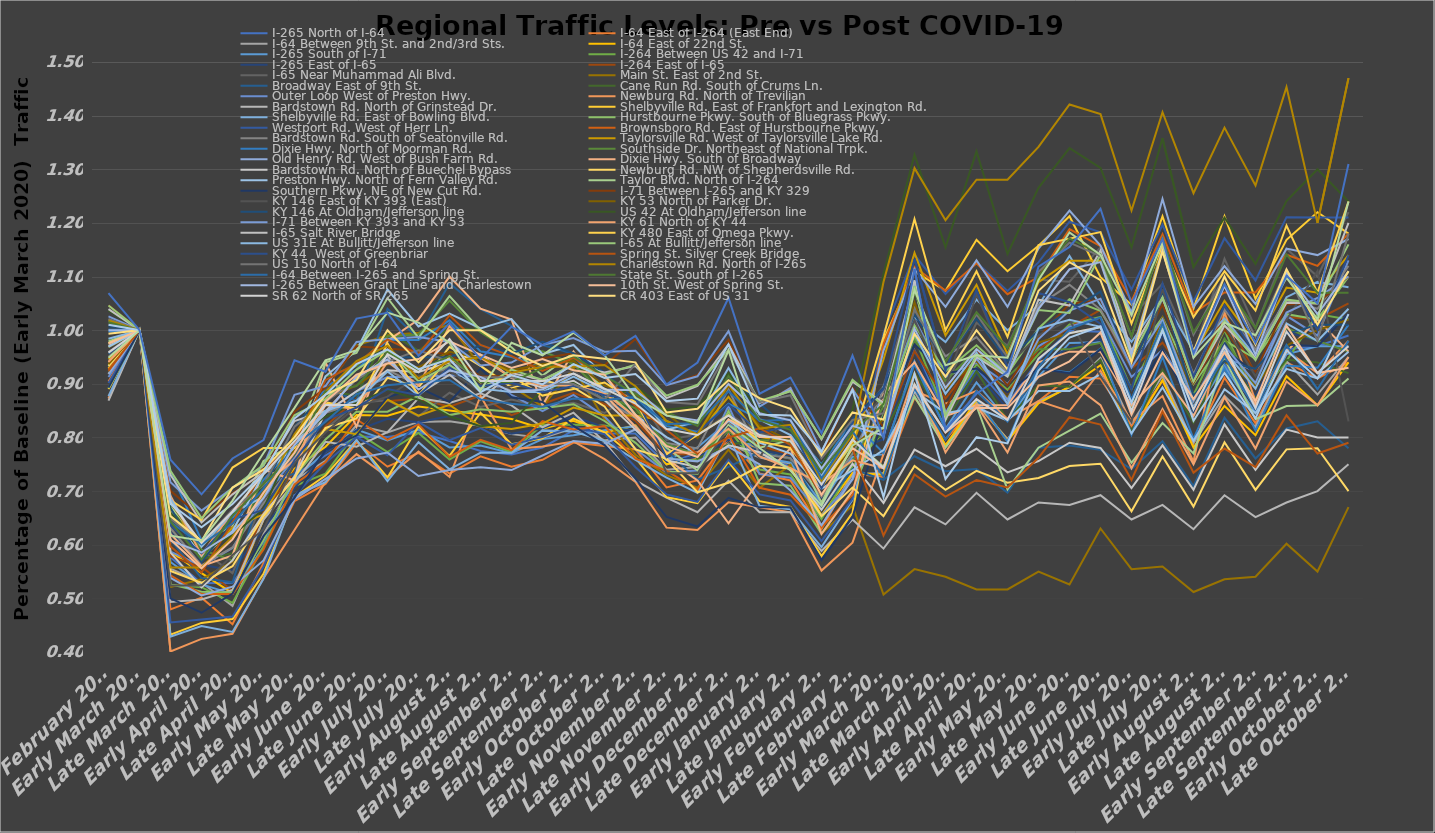
| Category | I-265 | I-64 | I-264 | I-65 | Main St. | Broadway | Cane Run Rd. | Outer Loop | Newburg Rd. | Bardstown Rd. | Shelbyville Rd. | Hurstbourne Pkwy. | Westport Rd. | Brownsboro Rd. | Taylorsville Rd. | Dixie Hwy. | Southside Dr. | Old Henry Rd. | Preston Hwy. | Taylor Blvd. | Southern Pkwy. | I-71 | KY 146 | KY 53 | US 42 | KY 61 | KY 480 | US 31E | KY 44  | Spring St. | US 150 | Charlestown Rd. | State St. | 10th St. | SR 62 | CR 403 | Veterans Pkwy. |
|---|---|---|---|---|---|---|---|---|---|---|---|---|---|---|---|---|---|---|---|---|---|---|---|---|---|---|---|---|---|---|---|---|---|---|---|---|---|
| February 2020 | 1 | 1.001 | 0.968 | 1.069 | 0.919 | 0.956 | 0.983 | 0.913 | 0.933 | 0.971 | 0.877 | 0.892 | 0.902 | 0.927 | 0.945 | 0.94 | 0.969 | 0.918 | 0.969 | 0.979 | 0.893 | 1.026 | 1.007 | 0.937 | 1.037 | 0.941 | 0.976 | 0.984 | 1.017 | 0.924 | 1.021 | 1.018 | 1.015 | 0.975 | 0.958 | 0.993 | 0.949 |
| Early March 2020 | 1 | 1 | 1 | 1 | 1 | 1 | 1 | 1 | 1 | 1 | 1 | 1 | 1 | 1 | 1 | 1 | 1 | 1 | 1 | 1 | 1 | 1 | 1 | 1 | 1 | 1 | 1 | 1 | 1 | 1 | 1 | 1 | 1 | 1 | 1 | 1 | 1 |
| Late March 2020 | 0.608 | 0.642 | 0.578 | 0.759 | 0.521 | 0.61 | 0.675 | 0.587 | 0.551 | 0.585 | 0.429 | 0.527 | 0.455 | 0.543 | 0.687 | 0.62 | 0.681 | 0.538 | 0.663 | 0.671 | 0.5 | 0.717 | 0.669 | 0.678 | 0.66 | 0.691 | 0.683 | 0.686 | 0.636 | 0.597 | 0.649 | 0.558 | 0.643 | 0.61 | 0.679 | 0.653 | 0.617 |
| Early April 2020 | 0.586 | 0.601 | 0.558 | 0.694 | 0.536 | 0.538 | 0.574 | 0.56 | 0.529 | 0.52 | 0.448 | 0.513 | 0.461 | 0.508 | 0.572 | 0.56 | 0.591 | 0.505 | 0.577 | 0.604 | 0.473 | 0.664 | 0.568 | 0.598 | 0.586 | 0.581 | 0.646 | 0.596 | 0.584 | 0.548 | 0.603 | 0.558 | 0.572 | 0.556 | 0.603 | 0.607 | 0.607 |
| Late April 2020 | 0.622 | 0.639 | 0.514 | 0.761 | 0.569 | 0.53 | 0.584 | 0.594 | 0.56 | 0.571 | 0.437 | 0.511 | 0.466 | 0.508 | 0.632 | 0.58 | 0.571 | 0.522 | 0.625 | 0.636 | 0.509 | 0.706 | 0.64 | 0.644 | 0.617 | 0.662 | 0.744 | 0.66 | 0.647 | 0.641 | 0.665 | 0.615 | 0.654 | 0.61 | 0.662 | 0.707 | 0.682 |
| Early May 2020 | 0.687 | 0.705 | 0.66 | 0.795 | 0.754 | 0.709 | 0.711 | 0.688 | 0.653 | 0.657 | 0.536 | 0.608 | 0.559 | 0.591 | 0.657 | 0.74 | 0.732 | 0.571 | 0.732 | 0.756 | 0.616 | 0.748 | 0.705 | 0.701 | 0.667 | 0.713 | 0.78 | 0.689 | 0.665 | 0.738 | 0.711 | 0.691 | 0.714 | 0.697 | 0.732 | 0.74 | 0.771 |
| Late May 2020 | 0.786 | 0.785 | 0.738 | 0.944 | 0.777 | 0.733 | 0.751 | 0.762 | 0.724 | 0.727 | 0.692 | 0.727 | 0.691 | 0.712 | 0.756 | 0.72 | 0.783 | 0.685 | 0.78 | 0.788 | 0.688 | 0.879 | 0.82 | 0.776 | 0.796 | 0.757 | 0.78 | 0.788 | 0.757 | 0.79 | 0.82 | 0.806 | 0.77 | 0.772 | 0.793 | 0.8 | 0.855 |
| Early June 2020 | 0.845 | 0.829 | 0.821 | 0.922 | 0.891 | 0.892 | 0.888 | 0.846 | 0.818 | 0.847 | 0.716 | 0.796 | 0.753 | 0.754 | 0.816 | 0.94 | 0.913 | 0.723 | 0.914 | 0.94 | 0.777 | 0.896 | 0.885 | 0.874 | 0.84 | 0.86 | 0.866 | 0.849 | 0.832 | 0.907 | 0.866 | 0.885 | 0.885 | 0.867 | 0.86 | 0.88 | 0.944 |
| Late June 2020 | 0.913 | 0.881 | 0.873 | 1.022 | 0.972 | 0.869 | 0.878 | 0.886 | 0.836 | 0.886 | 0.796 | 0.848 | 0.801 | 0.834 | 0.806 | 0.82 | 0.933 | 0.761 | 0.962 | 0.958 | 0.804 | 0.978 | 0.906 | 0.897 | 0.864 | 0.853 | 0.854 | 0.869 | 0.855 | 0.938 | 0.908 | 0.942 | 0.896 | 0.917 | 0.86 | 0.907 | 0.963 |
| Early July 2020 | 0.945 | 0.897 | 0.868 | 1.032 | 0.991 | 1.04 | 0.998 | 0.913 | 0.911 | 0.925 | 0.719 | 0.848 | 0.767 | 0.796 | 0.871 | 0.98 | 0.988 | 0.772 | 1.076 | 1.06 | 0.875 | 0.984 | 0.95 | 0.937 | 0.889 | 0.941 | 0.976 | 0.923 | 0.89 | 0.983 | 0.941 | 0.971 | 0.959 | 0.938 | 0.955 | 1 | 1.033 |
| Late July 2020 | 0.889 | 0.903 | 0.873 | 0.953 | 0.995 | 0.984 | 0.962 | 0.913 | 0.893 | 0.922 | 0.791 | 0.878 | 0.829 | 0.824 | 0.841 | 1.02 | 0.992 | 0.728 | 1.007 | 0.986 | 0.893 | 0.987 | 0.95 | 0.931 | 0.87 | 0.897 | 0.878 | 0.878 | 0.879 | 0.955 | 0.962 | 0.91 | 0.926 | 0.946 | 0.922 | 0.94 | 1.014 |
| Early August 2020 | 0.925 | 0.907 | 0.857 | 1.013 | 1.009 | 1.088 | 1.005 | 0.916 | 0.969 | 0.94 | 0.741 | 0.842 | 0.795 | 0.764 | 0.861 | 1.1 | 1.055 | 0.739 | 1.031 | 1.064 | 0.866 | 0.978 | 0.95 | 0.96 | 0.84 | 1.007 | 0.951 | 0.929 | 0.931 | 1.028 | 0.941 | 0.942 | 0.952 | 0.979 | 0.983 | 1 | 0.977 |
| Late August 2020 | 0.913 | 0.871 | 0.878 | 0.946 | 0.934 | 1.04 | 1 | 0.913 | 0.933 | 0.954 | 0.771 | 0.853 | 0.817 | 0.796 | 0.821 | 1.04 | 0.996 | 0.745 | 1.003 | 1 | 0.929 | 0.934 | 0.971 | 0.948 | 0.821 | 0.949 | 0.902 | 0.891 | 0.896 | 0.972 | 0.912 | 0.95 | 0.903 | 0.954 | 0.905 | 1 | 0.888 |
| Early September 2020 | 0.885 | 0.863 | 0.842 | 1.006 | 0.896 | 1.008 | 0.962 | 0.879 | 0.893 | 0.911 | 0.771 | 0.848 | 0.787 | 0.776 | 0.816 | 1.02 | 0.961 | 0.739 | 1.021 | 0.968 | 0.875 | 0.94 | 0.957 | 0.925 | 0.827 | 0.912 | 0.915 | 0.885 | 0.902 | 0.952 | 0.912 | 0.921 | 0.903 | 0.929 | 0.905 | 0.96 | 0.977 |
| Late September 2020 | 0.889 | 0.857 | 0.862 | 0.972 | 0.858 | 0.972 | 0.931 | 0.849 | 0.907 | 0.893 | 0.813 | 0.854 | 0.801 | 0.831 | 0.826 | 0.86 | 0.961 | 0.766 | 0.955 | 0.915 | 0.866 | 0.973 | 0.978 | 0.937 | 0.889 | 0.897 | 0.878 | 0.885 | 0.884 | 0.924 | 0.9 | 0.932 | 0.929 | 0.946 | 0.905 | 0.933 | 0.953 |
| Early October 2020 | 0.919 | 0.872 | 0.883 | 0.998 | 0.929 | 0.956 | 0.945 | 0.879 | 0.893 | 0.906 | 0.811 | 0.862 | 0.82 | 0.815 | 0.856 | 0.96 | 0.937 | 0.793 | 0.973 | 0.958 | 0.821 | 0.985 | 0.957 | 0.943 | 0.901 | 0.897 | 0.89 | 0.913 | 0.896 | 0.948 | 0.9 | 0.932 | 0.952 | 0.925 | 0.919 | 0.953 | 0.995 |
| Late October 2020 | 0.889 | 0.87 | 0.862 | 0.953 | 0.834 | 0.873 | 0.88 | 0.839 | 0.858 | 0.87 | 0.793 | 0.831 | 0.806 | 0.821 | 0.841 | 0.88 | 0.878 | 0.788 | 0.914 | 0.887 | 0.786 | 0.96 | 0.921 | 0.897 | 0.87 | 0.882 | 0.902 | 0.885 | 0.879 | 0.914 | 0.87 | 0.935 | 0.914 | 0.917 | 0.891 | 0.947 | 0.953 |
| Early November 2020 | 0.888 | 0.875 | 0.831 | 0.989 | 0.768 | 0.837 | 0.847 | 0.779 | 0.778 | 0.815 | 0.758 | 0.79 | 0.744 | 0.76 | 0.841 | 0.82 | 0.854 | 0.815 | 0.842 | 0.837 | 0.723 | 0.962 | 0.871 | 0.879 | 0.895 | 0.838 | 0.866 | 0.891 | 0.873 | 0.859 | 0.937 | 0.896 | 0.881 | 0.842 | 0.863 | 0.94 | 0.874 |
| Late November 2020 | 0.841 | 0.825 | 0.769 | 0.899 | 0.73 | 0.777 | 0.828 | 0.735 | 0.76 | 0.758 | 0.725 | 0.737 | 0.694 | 0.738 | 0.831 | 0.76 | 0.787 | 0.761 | 0.801 | 0.781 | 0.652 | 0.898 | 0.813 | 0.845 | 0.852 | 0.772 | 0.768 | 0.814 | 0.763 | 0.814 | 0.866 | 0.831 | 0.848 | 0.784 | 0.816 | 0.847 | 0.841 |
| Early December 2020 | 0.832 | 0.827 | 0.769 | 0.94 | 0.706 | 0.721 | 0.761 | 0.738 | 0.698 | 0.745 | 0.697 | 0.732 | 0.68 | 0.703 | 0.806 | 0.72 | 0.768 | 0.755 | 0.77 | 0.739 | 0.634 | 0.914 | 0.827 | 0.799 | 0.858 | 0.772 | 0.805 | 0.83 | 0.809 | 0.769 | 0.862 | 0.806 | 0.822 | 0.763 | 0.804 | 0.853 | 0.827 |
| Late December 2020 | 0.9 | 0.886 | 0.831 | 1.06 | 0.777 | 0.745 | 0.787 | 0.859 | 0.716 | 0.785 | 0.807 | 0.85 | 0.758 | 0.805 | 0.876 | 0.64 | 0.811 | 0.783 | 0.832 | 0.823 | 0.688 | 0.998 | 0.914 | 0.897 | 0.92 | 0.816 | 0.841 | 0.929 | 0.861 | 0.8 | 0.962 | 0.899 | 0.914 | 0.834 | 0.841 | 0.907 | 0.963 |
| Early January 2021 | 0.845 | 0.831 | 0.784 | 0.881 | 0.706 | 0.773 | 0.794 | 0.732 | 0.747 | 0.772 | 0.673 | 0.715 | 0.694 | 0.706 | 0.801 | 0.72 | 0.795 | 0.75 | 0.79 | 0.781 | 0.67 | 0.857 | 0.863 | 0.822 | 0.852 | 0.765 | 0.793 | 0.833 | 0.809 | 0.817 | 0.866 | 0.817 | 0.833 | 0.801 | 0.804 | 0.873 | 0.78 |
| Late January 2021 | 0.832 | 0.834 | 0.769 | 0.912 | 0.749 | 0.761 | 0.792 | 0.725 | 0.742 | 0.74 | 0.666 | 0.71 | 0.683 | 0.693 | 0.791 | 0.78 | 0.791 | 0.701 | 0.77 | 0.795 | 0.67 | 0.892 | 0.813 | 0.793 | 0.815 | 0.743 | 0.78 | 0.804 | 0.821 | 0.786 | 0.879 | 0.824 | 0.814 | 0.801 | 0.793 | 0.853 | 0.738 |
| Early February 2021 | 0.742 | 0.724 | 0.706 | 0.808 | 0.621 | 0.665 | 0.691 | 0.654 | 0.653 | 0.665 | 0.596 | 0.621 | 0.607 | 0.633 | 0.716 | 0.62 | 0.713 | 0.636 | 0.704 | 0.678 | 0.571 | 0.773 | 0.712 | 0.707 | 0.747 | 0.713 | 0.707 | 0.728 | 0.705 | 0.693 | 0.762 | 0.719 | 0.736 | 0.693 | 0.712 | 0.767 | 0.673 |
| Late February 2021 | 0.822 | 0.811 | 0.79 | 0.953 | 0.673 | 0.741 | 0.775 | 0.721 | 0.707 | 0.751 | 0.684 | 0.701 | 0.685 | 0.693 | 0.786 | 0.7 | 0.756 | 0.723 | 0.739 | 0.795 | 0.652 | 0.89 | 0.835 | 0.782 | 0.852 | 0.757 | 0.793 | 0.824 | 0.827 | 0.779 | 0.833 | 0.806 | 0.81 | 0.78 | 0.796 | 0.847 | 0.785 |
| Early March 2021 | 0.804 | 0.727 | 0.81 | 0.8 | 0.507 | 0.721 | 0.806 | 0.839 | 0.653 | 0.678 | 0.895 | 0.843 | 0.994 | 0.974 | 0.945 | 0.88 | 0.858 | 0.962 | 0.777 | 0.746 | 0.839 | 0.801 | 0.892 | 0.833 | 1.105 | 0.743 | 0.988 | 0.817 | 0.89 | 0.617 | 0.845 | 1.09 | 0.862 | 0.743 | 0.743 | 0.833 | 0.818 |
| Late March 2021 | 1.003 | 0.892 | 0.961 | 1.114 | 0.555 | 0.765 | 0.921 | 1.02 | 0.747 | 0.777 | 1.024 | 1.009 | 1.14 | 1.118 | 1.144 | 0.94 | 0.98 | 1.114 | 0.887 | 0.876 | 0.973 | 1.086 | 1.029 | 1.052 | 1.327 | 0.919 | 1.207 | 0.994 | 1.133 | 0.731 | 1.038 | 1.302 | 1.071 | 0.896 | 0.899 | 0.993 | 1.075 |
| Early April 2021 | 0.892 | 0.796 | 0.873 | 0.815 | 0.54 | 0.737 | 0.83 | 0.913 | 0.702 | 0.746 | 0.978 | 0.923 | 1.067 | 1.073 | 0.99 | 0.84 | 0.906 | 1.043 | 0.845 | 0.781 | 0.92 | 0.845 | 0.942 | 0.891 | 1.154 | 0.772 | 1 | 0.881 | 0.925 | 0.69 | 0.941 | 1.205 | 0.941 | 0.809 | 0.81 | 0.913 | 0.935 |
| Late April 2021 | 0.965 | 0.886 | 0.945 | 0.881 | 0.517 | 0.741 | 0.923 | 0.94 | 0.738 | 0.779 | 1.057 | 0.972 | 1.126 | 1.125 | 1.085 | 0.86 | 0.965 | 1.13 | 0.856 | 0.859 | 0.929 | 0.947 | 1.022 | 0.943 | 1.333 | 0.86 | 1.11 | 0.958 | 1.075 | 0.721 | 1.029 | 1.281 | 1.033 | 0.855 | 0.872 | 1 | 0.953 |
| Early May 2021 | 0.917 | 0.829 | 0.883 | 0.922 | 0.517 | 0.697 | 0.833 | 0.899 | 0.716 | 0.735 | 1 | 0.918 | 1.073 | 1.067 | 0.955 | 0.86 | 0.913 | 1.043 | 0.832 | 0.703 | 0.884 | 0.87 | 0.942 | 0.874 | 1.142 | 0.772 | 0.988 | 0.862 | 0.931 | 0.707 | 0.95 | 1.281 | 0.967 | 0.855 | 0.832 | 0.927 | 0.949 |
| Late May 2021 | 1.04 | 0.931 | 0.964 | 1.119 | 0.55 | 0.781 | 0.897 | 0.97 | 0.724 | 0.756 | 1.046 | 1.003 | 1.126 | 1.099 | 1.09 | 0.94 | 0.965 | 1.152 | 0.887 | 0.781 | 0.929 | 0.984 | 1 | 0.977 | 1.265 | 0.897 | 1.159 | 1.003 | 1.069 | 0.762 | 1.109 | 1.342 | 1.1 | 0.913 | 0.947 | 1.073 | 1.093 |
| Early June 2021 | 1.114 | 1.003 | 1.006 | 1.155 | 0.526 | 0.785 | 0.895 | 1.007 | 0.747 | 0.79 | 1.138 | 1.058 | 1.202 | 1.188 | 1.129 | 0.96 | 0.965 | 1.223 | 0.887 | 0.813 | 0.92 | 1.037 | 1.036 | 0.994 | 1.34 | 0.904 | 1.171 | 1.019 | 1.052 | 0.838 | 1.163 | 1.421 | 1.171 | 0.942 | 0.994 | 1.127 | 1.182 |
| Late June 2021 | 1.127 | 1.024 | 1.038 | 1.226 | 0.63 | 0.777 | 0.945 | 1.023 | 0.751 | 0.78 | 1.046 | 1.036 | 1.183 | 1.157 | 1.129 | 0.96 | 0.976 | 1.158 | 0.918 | 0.845 | 0.964 | 1.059 | 1.072 | 1.006 | 1.302 | 0.86 | 1.183 | 1.006 | 1.012 | 0.824 | 1.138 | 1.403 | 1.141 | 0.996 | 1.006 | 1.093 | 1.14 |
| Early July 2021 | 0.954 | 0.871 | 0.929 | 1.05 | 0.555 | 0.741 | 0.811 | 0.913 | 0.662 | 0.706 | 0.978 | 0.944 | 1.076 | 1.054 | 0.955 | 0.86 | 0.858 | 1.033 | 0.808 | 0.753 | 0.866 | 0.931 | 0.928 | 0.868 | 1.154 | 0.743 | 1.012 | 0.865 | 0.89 | 0.721 | 0.987 | 1.223 | 0.989 | 0.842 | 0.849 | 0.94 | 1.028 |
| Late July 2021 | 1.149 | 1.012 | 0.977 | 1.17 | 0.559 | 0.793 | 0.926 | 0.963 | 0.764 | 0.785 | 1.062 | 1.024 | 1.197 | 1.179 | 1.154 | 0.92 | 1.012 | 1.245 | 0.893 | 0.827 | 0.964 | 1.02 | 1.065 | 1.023 | 1.358 | 0.853 | 1.159 | 1.013 | 1.087 | 0.848 | 1.172 | 1.406 | 1.171 | 0.959 | 1 | 1.147 | 1.164 |
| Early August 2021 | 0.95 | 0.853 | 0.9 | 0.957 | 0.512 | 0.709 | 0.828 | 0.876 | 0.671 | 0.702 | 0.96 | 0.9 | 1.053 | 1.032 | 0.955 | 0.84 | 0.866 | 1.043 | 0.794 | 0.77 | 0.848 | 0.868 | 0.878 | 0.874 | 1.117 | 0.75 | 1.024 | 0.856 | 0.913 | 0.734 | 0.992 | 1.255 | 0.996 | 0.871 | 0.852 | 0.96 | 0.949 |
| Late August 2021 | 1.083 | 0.951 | 1.033 | 1.086 | 0.536 | 0.837 | 0.952 | 0.95 | 0.791 | 0.824 | 1.022 | 0.981 | 1.171 | 1.07 | 1.055 | 0.96 | 0.984 | 1.12 | 0.89 | 0.947 | 0.964 | 0.971 | 0.942 | 0.943 | 1.21 | 0.875 | 1.11 | 0.962 | 1.046 | 0.779 | 1.1 | 1.378 | 1.086 | 0.959 | 0.969 | 1.1 | 1.014 |
| Early September 2021 | 0.954 | 0.853 | 0.917 | 0.976 | 0.54 | 0.761 | 0.873 | 0.923 | 0.702 | 0.74 | 0.952 | 0.947 | 1.093 | 1.07 | 0.975 | 0.86 | 0.894 | 1.049 | 0.845 | 0.834 | 0.92 | 0.901 | 0.928 | 0.897 | 1.123 | 0.779 | 1.037 | 0.891 | 0.954 | 0.745 | 0.987 | 1.27 | 1.004 | 0.867 | 0.855 | 0.973 | 0.991 |
| Late September 2021 | 1.108 | 0.972 | 1.025 | 1.101 | 0.602 | 0.817 | 0.945 | 1.027 | 0.778 | 0.815 | 1.062 | 1.03 | 1.211 | 1.141 | 1.08 | 0.96 | 1.004 | 1.152 | 0.928 | 0.859 | 0.973 | 1.033 | 0.993 | 0.971 | 1.241 | 0.904 | 1.195 | 1.013 | 1.104 | 0.841 | 1.113 | 1.453 | 1.141 | 1.008 | 0.997 | 1.113 | 1.098 |
| Early October 2021 | 1.03 | 0.89 | 1.02 | 1.05 | 0.55 | 0.83 | 0.94 | 0.99 | 0.78 | 0.8 | 1.09 | 1.02 | 1.21 | 1.12 | 1.07 | 1.02 | 0.98 | 1.14 | 0.91 | 0.86 | 0.97 | 1.06 | 1.01 | 1 | 1.3 | 0.86 | 1.07 | 0.98 | 1 | 0.77 | 0.98 | 1.2 | 1.07 | 0.92 | 0.92 | 1.01 | 1.02 |
| Late October 2021 | 1.11 | 0.98 | 1.05 | 1.31 | 0.67 | 0.78 | 0.92 | 1.13 | 0.7 | 0.8 | 1.08 | 1.1 | 1.21 | 1.18 | 1.14 | 0.96 | 0.96 | 1.17 | 0.96 | 0.91 | 1.03 | 1.1 | 1.01 | 1.02 | 1.24 | 0.95 | 1.24 | 1.04 | 1.14 | 0.79 | 1.18 | 1.47 | 1.07 | 0.93 | 0.97 | 1.11 | 1.24 |